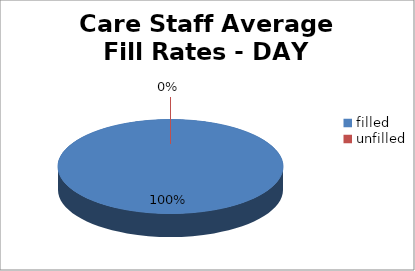
| Category | Series 0 |
|---|---|
| filled | 100 |
| unfilled | 0 |